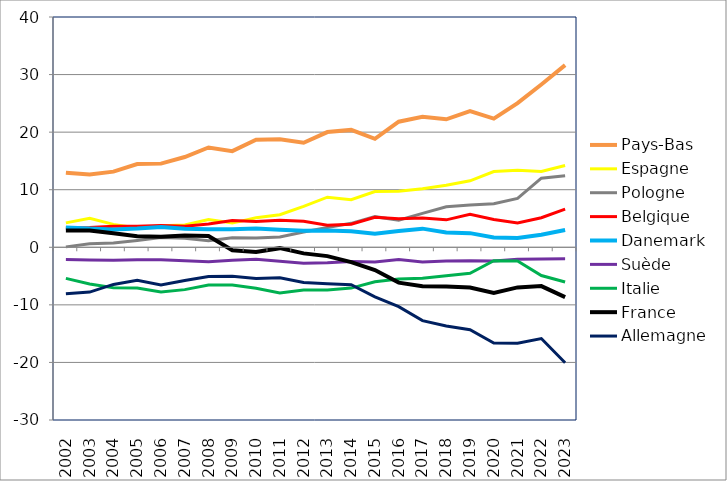
| Category | Pays-Bas | Espagne | Pologne | Belgique | Danemark | Suède | Italie | France | Allemagne |
|---|---|---|---|---|---|---|---|---|---|
| 2002 | 12.957 | 4.24 | 0.072 | 3.341 | 3.423 | -2.136 | -5.402 | 2.9 | -8.069 |
| 2003 | 12.643 | 5.034 | 0.613 | 3.427 | 3.272 | -2.211 | -6.377 | 2.902 | -7.776 |
| 2004 | 13.142 | 3.977 | 0.736 | 3.675 | 3.075 | -2.232 | -7.043 | 2.44 | -6.449 |
| 2005 | 14.457 | 3.367 | 1.195 | 3.662 | 3.248 | -2.154 | -7.08 | 1.934 | -5.731 |
| 2006 | 14.531 | 3.744 | 1.706 | 3.768 | 3.522 | -2.16 | -7.762 | 1.82 | -6.538 |
| 2007 | 15.682 | 3.863 | 1.565 | 3.656 | 3.204 | -2.33 | -7.356 | 2.042 | -5.761 |
| 2008 | 17.336 | 4.829 | 1.14 | 4.055 | 3.144 | -2.533 | -6.57 | 1.969 | -5.058 |
| 2009 | 16.694 | 4.202 | 1.638 | 4.637 | 3.125 | -2.27 | -6.572 | -0.521 | -5.038 |
| 2010 | 18.68 | 5.12 | 1.622 | 4.47 | 3.278 | -2.098 | -7.123 | -0.818 | -5.405 |
| 2011 | 18.772 | 5.647 | 1.8 | 4.687 | 3.043 | -2.441 | -7.952 | -0.15 | -5.291 |
| 2012 | 18.152 | 7.116 | 2.657 | 4.516 | 2.876 | -2.784 | -7.428 | -1.056 | -6.106 |
| 2013 | 20.011 | 8.701 | 3.432 | 3.844 | 2.934 | -2.697 | -7.399 | -1.537 | -6.339 |
| 2014 | 20.392 | 8.274 | 4.16 | 4.008 | 2.798 | -2.474 | -7.09 | -2.579 | -6.513 |
| 2015 | 18.836 | 9.689 | 5.322 | 5.196 | 2.367 | -2.544 | -5.979 | -3.946 | -8.623 |
| 2016 | 21.817 | 9.739 | 4.693 | 4.953 | 2.84 | -2.12 | -5.507 | -6.14 | -10.314 |
| 2017 | 22.677 | 10.177 | 5.899 | 5.065 | 3.237 | -2.544 | -5.382 | -6.768 | -12.734 |
| 2018 | 22.227 | 10.762 | 7.04 | 4.767 | 2.552 | -2.4 | -4.927 | -6.821 | -13.667 |
| 2019 | 23.638 | 11.542 | 7.348 | 5.723 | 2.456 | -2.34 | -4.508 | -6.977 | -14.31 |
| 2020 | 22.345 | 13.145 | 7.564 | 4.838 | 1.71 | -2.389 | -2.331 | -7.935 | -16.635 |
| 2021 | 25.037 | 13.385 | 8.483 | 4.233 | 1.604 | -2.068 | -2.373 | -6.97 | -16.654 |
| 2022 | 28.276 | 13.173 | 12.01 | 5.126 | 2.17 | -2.039 | -4.904 | -6.74 | -15.852 |
| 2023 | 31.634 | 14.199 | 12.444 | 6.62 | 3.003 | -1.999 | -6.025 | -8.66 | -20.044 |